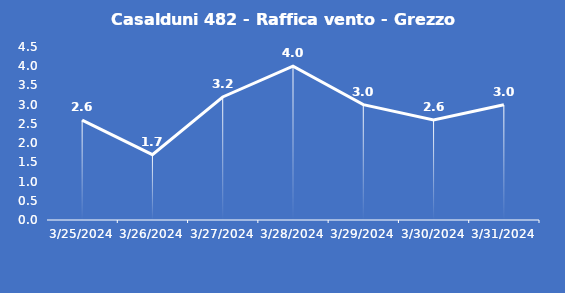
| Category | Casalduni 482 - Raffica vento - Grezzo (m/s) |
|---|---|
| 3/25/24 | 2.6 |
| 3/26/24 | 1.7 |
| 3/27/24 | 3.2 |
| 3/28/24 | 4 |
| 3/29/24 | 3 |
| 3/30/24 | 2.6 |
| 3/31/24 | 3 |